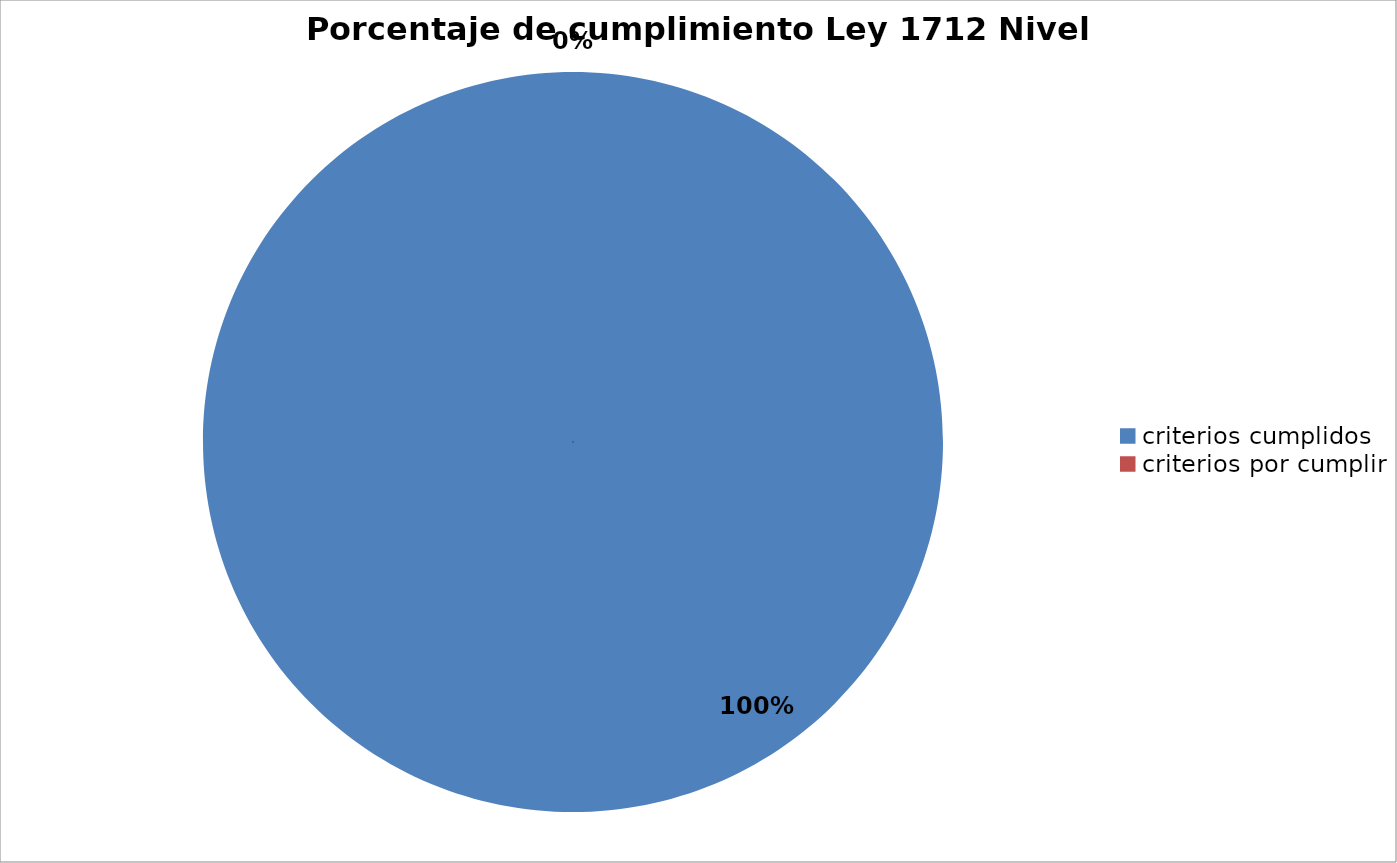
| Category | Series 0 |
|---|---|
| criterios cumplidos | 136 |
| criterios por cumplir | 0 |